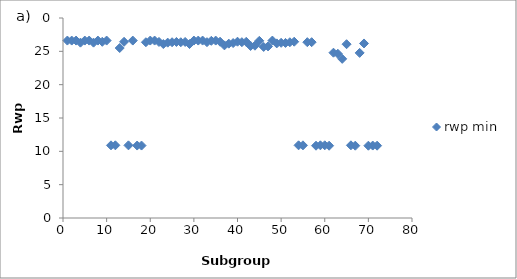
| Category | rwp min |
|---|---|
| 1.0 | 26.614 |
| 2.0 | 26.615 |
| 3.0 | 26.615 |
| 4.0 | 26.303 |
| 5.0 | 26.614 |
| 6.0 | 26.614 |
| 7.0 | 26.303 |
| 8.0 | 26.614 |
| 9.0 | 26.431 |
| 10.0 | 26.614 |
| 11.0 | 10.9 |
| 12.0 | 10.902 |
| 13.0 | 25.497 |
| 14.0 | 26.431 |
| 15.0 | 10.9 |
| 16.0 | 26.614 |
| 17.0 | 10.866 |
| 18.0 | 10.867 |
| 19.0 | 26.365 |
| 20.0 | 26.614 |
| 21.0 | 26.614 |
| 22.0 | 26.406 |
| 23.0 | 26.094 |
| 24.0 | 26.303 |
| 25.0 | 26.364 |
| 26.0 | 26.407 |
| 27.0 | 26.364 |
| 28.0 | 26.407 |
| 29.0 | 26.094 |
| 30.0 | 26.614 |
| 31.0 | 26.614 |
| 32.0 | 26.614 |
| 33.0 | 26.373 |
| 34.0 | 26.576 |
| 35.0 | 26.614 |
| 36.0 | 26.443 |
| 37.0 | 25.894 |
| 38.0 | 26.15 |
| 39.0 | 26.24 |
| 40.0 | 26.444 |
| 41.0 | 26.373 |
| 42.0 | 26.426 |
| 43.0 | 25.8 |
| 44.0 | 25.845 |
| 45.0 | 26.576 |
| 46.0 | 25.661 |
| 47.0 | 25.735 |
| 48.0 | 26.615 |
| 49.0 | 26.19 |
| 50.0 | 26.278 |
| 51.0 | 26.257 |
| 52.0 | 26.365 |
| 53.0 | 26.444 |
| 54.0 | 10.902 |
| 55.0 | 10.9 |
| 56.0 | 26.373 |
| 57.0 | 26.373 |
| 58.0 | 10.844 |
| 59.0 | 10.902 |
| 60.0 | 10.907 |
| 61.0 | 10.844 |
| 62.0 | 24.794 |
| 63.0 | 24.634 |
| 64.0 | 23.873 |
| 65.0 | 26.07 |
| 66.0 | 10.901 |
| 67.0 | 10.845 |
| 68.0 | 24.766 |
| 69.0 | 26.18 |
| 70.0 | 10.844 |
| 71.0 | 10.868 |
| 72.0 | 10.847 |